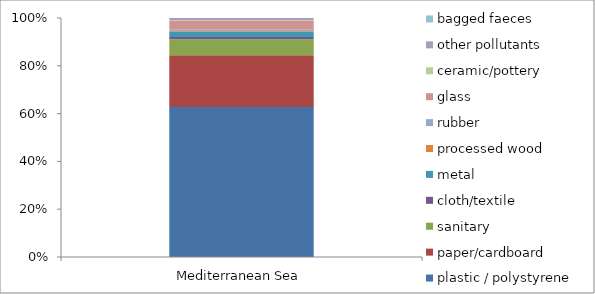
| Category | plastic / polystyrene | paper/cardboard | sanitary | cloth/textile | metal | processed wood | rubber | glass | ceramic/pottery | other pollutants | bagged faeces |
|---|---|---|---|---|---|---|---|---|---|---|---|
| Mediterranean Sea | 16323 | 5604 | 1750 | 232 | 588 | 82 | 174 | 958 | 68 | 204 | 4 |